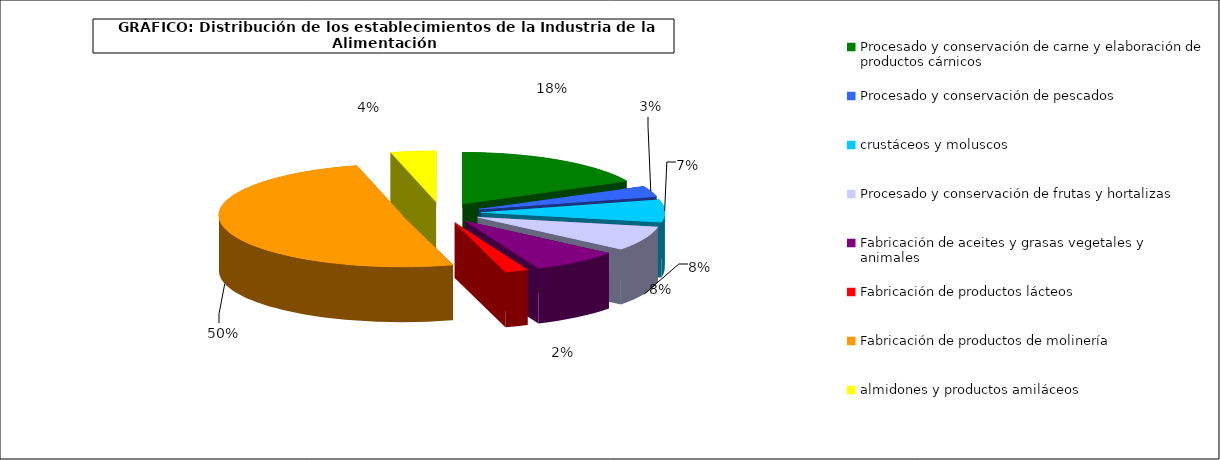
| Category | Procesado y conservación de carne y elaboración de productos cárnicos |
|---|---|
| 0 | 4640 |
| 1 | 881 |
| 2 | 1842 |
| 3 | 2026 |
| 4 | 2043 |
| 5 | 537 |
| 6 | 13259 |
| 7 | 1050 |